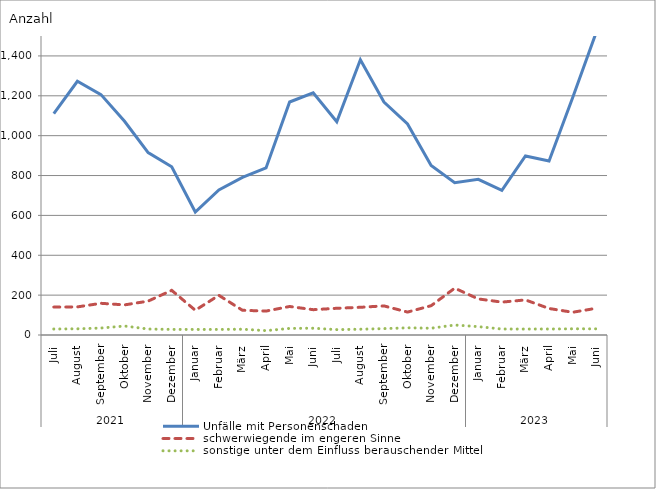
| Category | Unfälle mit Personenschaden | schwerwiegende im engeren Sinne | sonstige unter dem Einfluss berauschender Mittel |
|---|---|---|---|
| 0 | 1110 | 140 | 30 |
| 1 | 1273 | 141 | 31 |
| 2 | 1206 | 159 | 35 |
| 3 | 1072 | 151 | 45 |
| 4 | 915 | 170 | 30 |
| 5 | 844 | 224 | 28 |
| 6 | 617 | 124 | 28 |
| 7 | 728 | 199 | 28 |
| 8 | 791 | 124 | 29 |
| 9 | 838 | 120 | 22 |
| 10 | 1169 | 143 | 33 |
| 11 | 1215 | 127 | 34 |
| 12 | 1070 | 134 | 27 |
| 13 | 1381 | 139 | 29 |
| 14 | 1169 | 146 | 32 |
| 15 | 1059 | 115 | 36 |
| 16 | 850 | 147 | 34 |
| 17 | 764 | 235 | 50 |
| 18 | 781 | 181 | 42 |
| 19 | 726 | 165 | 30 |
| 20 | 898 | 176 | 30 |
| 21 | 873 | 133 | 30 |
| 22 | 1190 | 114 | 31 |
| 23 | 1518 | 134 | 31 |